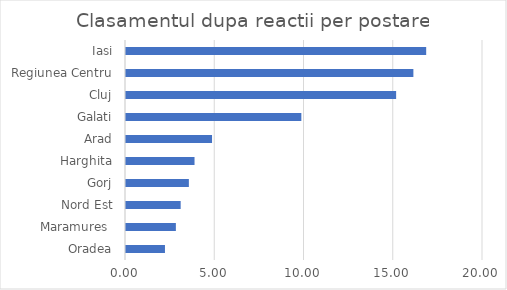
| Category | Series 0 |
|---|---|
| Oradea | 2.183 |
| Maramures  | 2.794 |
| Nord Est | 3.062 |
| Gorj | 3.522 |
| Harghita | 3.839 |
| Arad | 4.82 |
| Galati | 9.824 |
| Cluj | 15.133 |
| Regiunea Centru | 16.1 |
| Iasi | 16.817 |